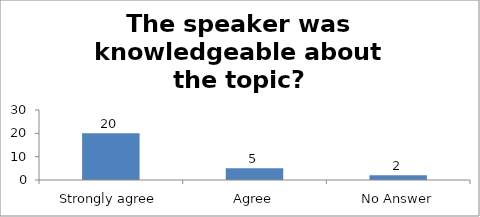
| Category | The speaker was knowledgeable about the topic? |
|---|---|
| Strongly agree | 20 |
| Agree | 5 |
| No Answer | 2 |